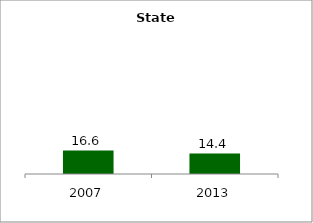
| Category | State |
|---|---|
| 2007.0 | 16.564 |
| 2013.0 | 14.439 |